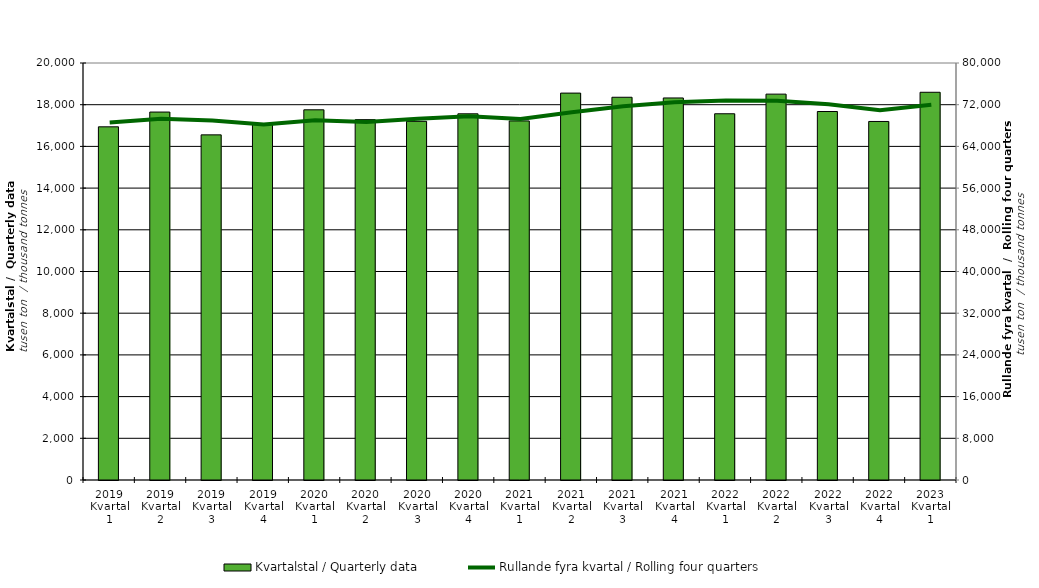
| Category | Kvartalstal / Quarterly data |
|---|---|
| 2019 Kvartal 1 | 16938.711 |
| 2019 Kvartal 2 | 17647.493 |
| 2019 Kvartal 3 | 16553.159 |
| 2019 Kvartal 4 | 17080.691 |
| 2020 Kvartal 1 | 17755.324 |
| 2020 Kvartal 2 | 17283.081 |
| 2020 Kvartal 3 | 17203.185 |
| 2020 Kvartal 4 | 17563.403 |
| 2021 Kvartal 1 | 17221.505 |
| 2021 Kvartal 2 | 18556.292 |
| 2021 Kvartal 3 | 18357.009 |
| 2021 Kvartal 4 | 18323.49 |
| 2022 Kvartal 1 | 17565.59 |
| 2022 Kvartal 2 | 18506.797 |
| 2022 Kvartal 3 | 17673.481 |
| 2022 Kvartal 4 | 17195.877 |
| 2023 Kvartal 1 | 18596.178 |